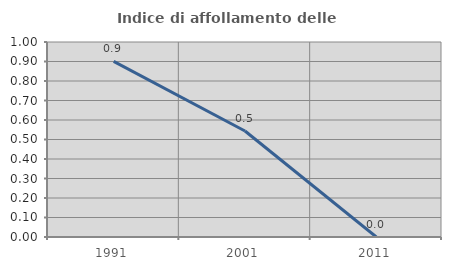
| Category | Indice di affollamento delle abitazioni  |
|---|---|
| 1991.0 | 0.901 |
| 2001.0 | 0.543 |
| 2011.0 | 0 |